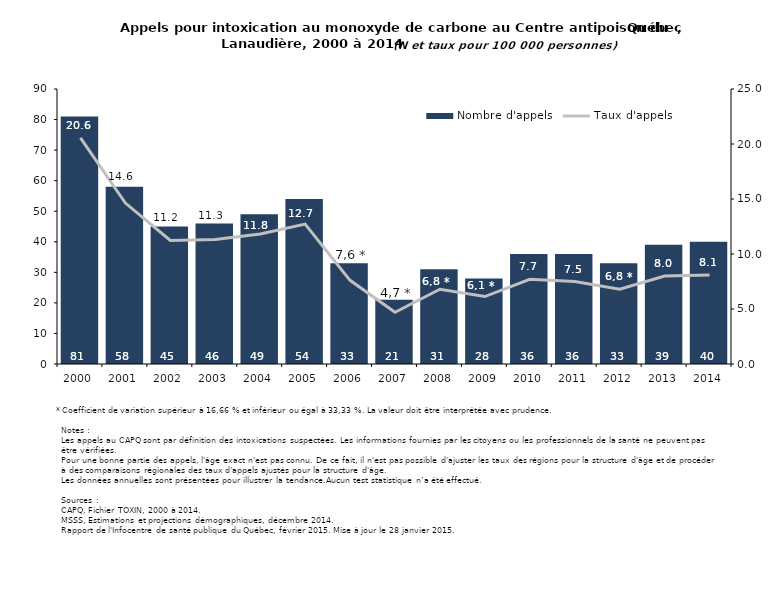
| Category | Nombre d'appels |
|---|---|
| 2000.0 | 81 |
| 2001.0 | 58 |
| 2002.0 | 45 |
| 2003.0 | 46 |
| 2004.0 | 49 |
| 2005.0 | 54 |
| 2006.0 | 33 |
| 2007.0 | 21 |
| 2008.0 | 31 |
| 2009.0 | 28 |
| 2010.0 | 36 |
| 2011.0 | 36 |
| 2012.0 | 33 |
| 2013.0 | 39 |
| 2014.0 | 40 |